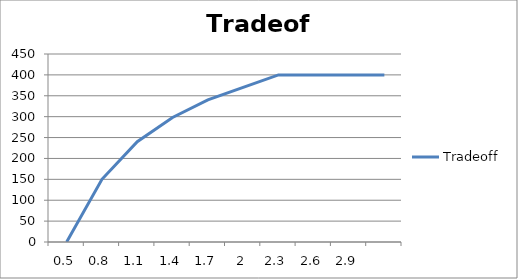
| Category | Tradeoff |
|---|---|
| 0.5 | 0 |
| 0.8 | 150 |
| 1.1 | 240 |
| 1.4 | 298 |
| 1.7 | 340 |
| 2.0 | 370 |
| 2.3 | 400 |
| 2.6 | 400 |
| 2.9 | 400 |